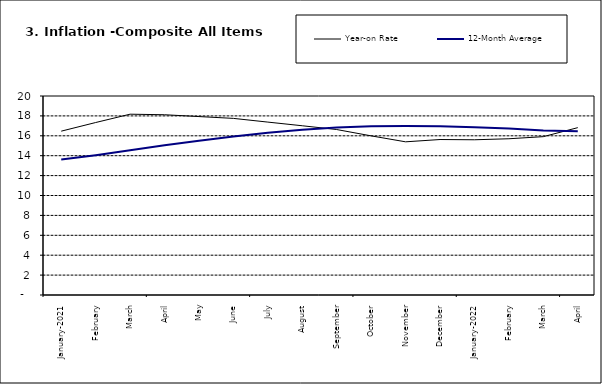
| Category | Year-on Rate | 12-Month Average |
|---|---|---|
| January-2021 | 16.466 | 13.616 |
| February | 17.335 | 14.053 |
| March | 18.171 | 14.554 |
| April | 18.117 | 15.039 |
| May | 17.933 | 15.499 |
| June | 17.751 | 15.927 |
| July | 17.377 | 16.298 |
| August | 17.009 | 16.601 |
| September | 16.63 | 16.83 |
| October | 15.994 | 16.958 |
| November | 15.396 | 16.979 |
| December | 15.625 | 16.953 |
| January-2022 | 15.601 | 16.869 |
| February | 15.702 | 16.728 |
| March | 15.915 | 16.544 |
| April | 16.819 | 16.449 |